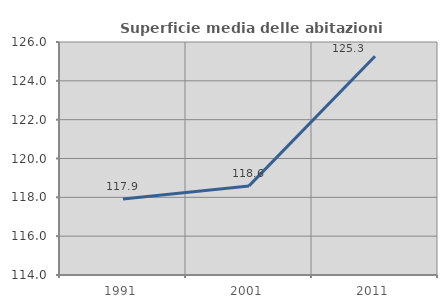
| Category | Superficie media delle abitazioni occupate |
|---|---|
| 1991.0 | 117.915 |
| 2001.0 | 118.589 |
| 2011.0 | 125.268 |